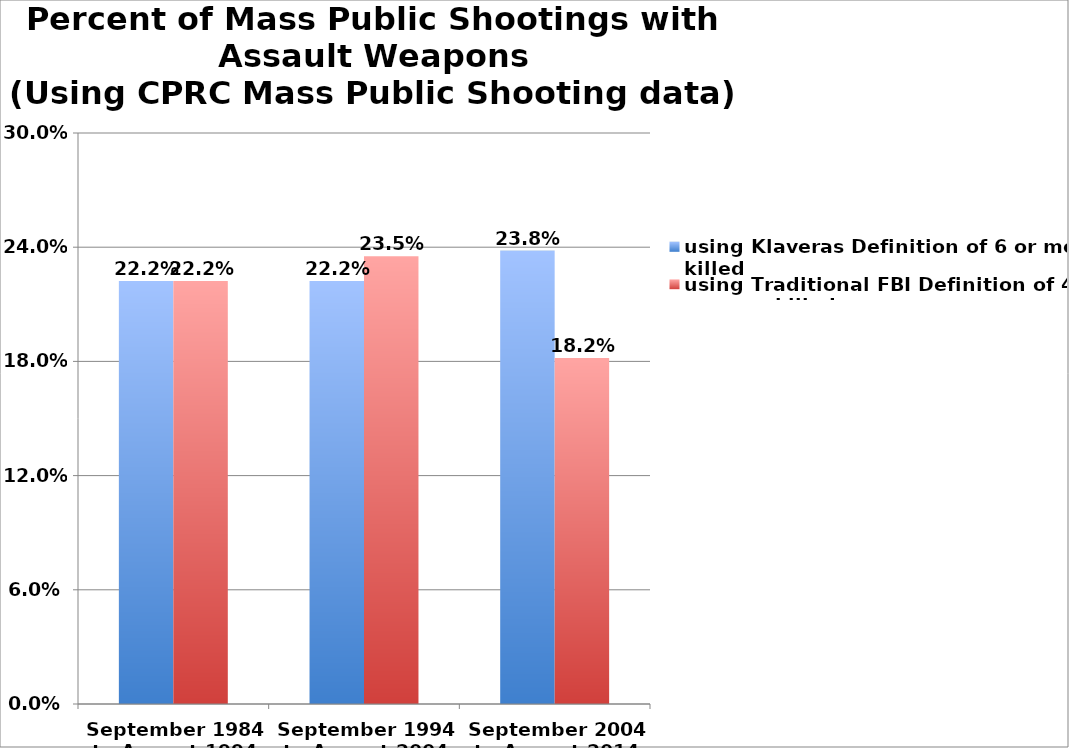
| Category | using Klaveras Definition of 6 or more killed | using Traditional FBI Definition of 4 or more killed |
|---|---|---|
| September 1984 to August 1994 | 0.222 | 0.222 |
| September 1994 to August 2004 | 0.222 | 0.235 |
| September 2004 to August 2014 | 0.238 | 0.182 |